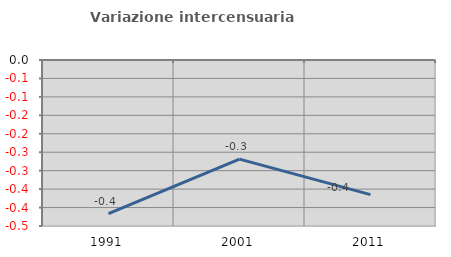
| Category | Variazione intercensuaria annua |
|---|---|
| 1991.0 | -0.417 |
| 2001.0 | -0.269 |
| 2011.0 | -0.365 |